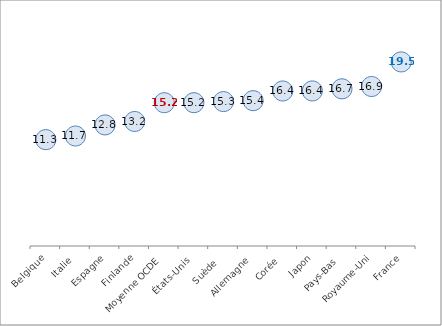
| Category | Premier degré |
|---|---|
| Belgique | 11.267 |
| Italie | 11.653 |
| Espagne | 12.827 |
| Finlande | 13.192 |
| Moyenne OCDE | 15.181 |
| États-Unis | 15.182 |
| Suède  | 15.299 |
| Allemagne | 15.396 |
| Corée | 16.421 |
| Japon | 16.427 |
| Pays-Bas | 16.65 |
| Royaume-Uni | 16.895 |
| France | 19.5 |